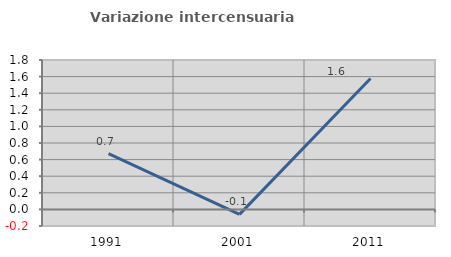
| Category | Variazione intercensuaria annua |
|---|---|
| 1991.0 | 0.672 |
| 2001.0 | -0.06 |
| 2011.0 | 1.577 |